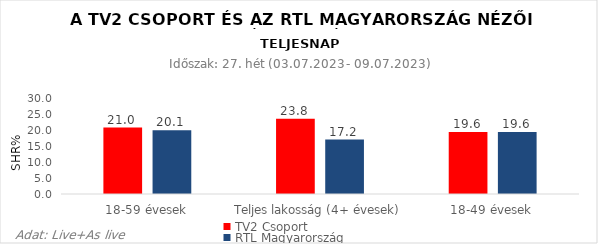
| Category | TV2 Csoport | RTL Magyarország |
|---|---|---|
| 18-59 évesek | 21 | 20.1 |
| Teljes lakosság (4+ évesek) | 23.8 | 17.2 |
| 18-49 évesek | 19.6 | 19.6 |